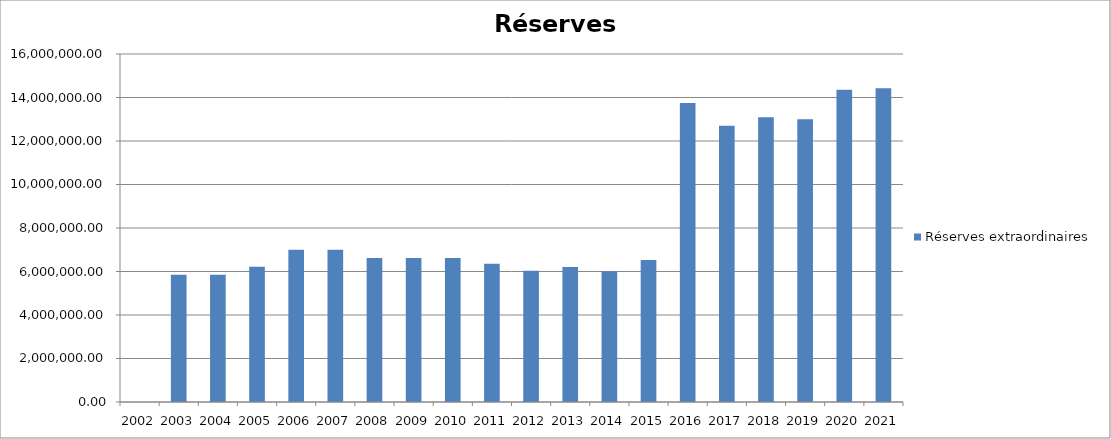
| Category | Réserves extraordinaires |
|---|---|
| 2002.0 | 0 |
| 2003.0 | 5848479.72 |
| 2004.0 | 5848479.72 |
| 2005.0 | 6223362.39 |
| 2006.0 | 6995594.08 |
| 2007.0 | 6995594.08 |
| 2008.0 | 6620711.41 |
| 2009.0 | 6620711.41 |
| 2010.0 | 6620711.41 |
| 2011.0 | 6352208.27 |
| 2012.0 | 6035580.41 |
| 2013.0 | 6210585.29 |
| 2014.0 | 6014056.72 |
| 2015.0 | 6527985.72 |
| 2016.0 | 13741737.6 |
| 2017.0 | 12698695.66 |
| 2018.0 | 13094426.04 |
| 2019.0 | 13003017.1 |
| 2020.0 | 14354364.82 |
| 2021.0 | 14425908.4 |